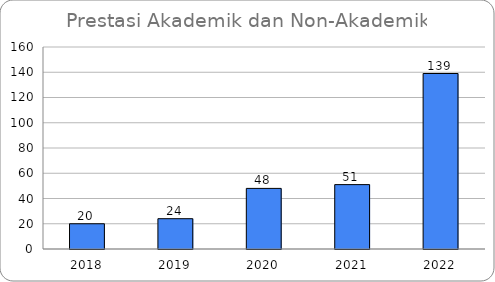
| Category | Jumlah |
|---|---|
| 2018.0 | 20 |
| 2019.0 | 24 |
| 2020.0 | 48 |
| 2021.0 | 51 |
| 2022.0 | 139 |